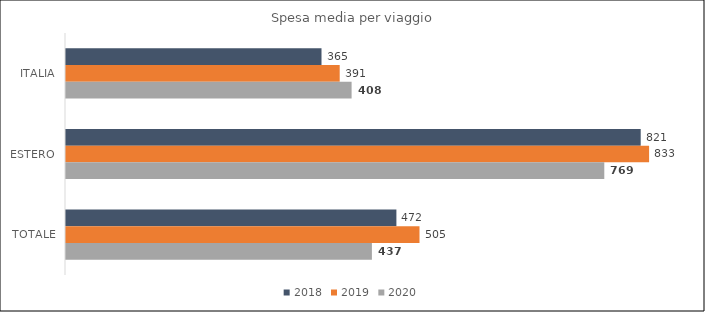
| Category | 2018 | 2019 | 2020 |
|---|---|---|---|
| ITALIA | 365 | 391 | 408 |
| ESTERO | 821 | 833 | 769 |
| TOTALE | 472 | 505 | 437 |